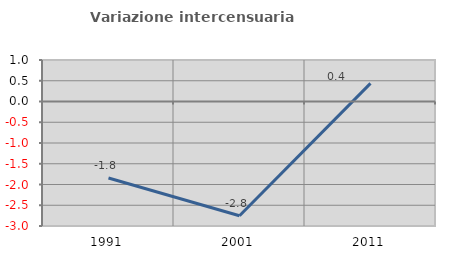
| Category | Variazione intercensuaria annua |
|---|---|
| 1991.0 | -1.843 |
| 2001.0 | -2.754 |
| 2011.0 | 0.436 |